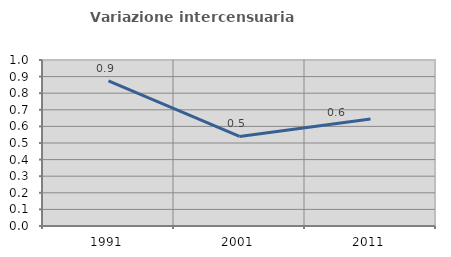
| Category | Variazione intercensuaria annua |
|---|---|
| 1991.0 | 0.874 |
| 2001.0 | 0.54 |
| 2011.0 | 0.644 |